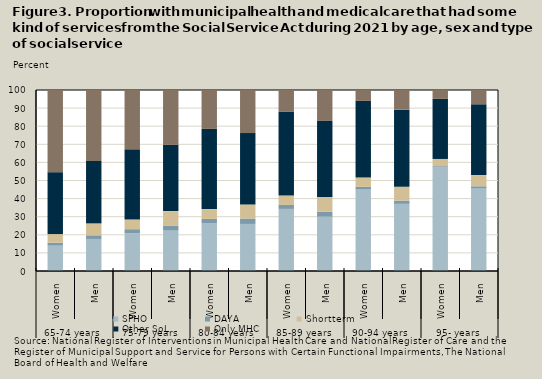
| Category | SPHO | DAYA | Shortterm | Other SoL | Only MHC |
|---|---|---|---|---|---|
| 0 | 14 | 1.6 | 4.8 | 34.2 | 45.4 |
| 1 | 17.7 | 2 | 6.6 | 34.5 | 39.2 |
| 2 | 20.9 | 2.2 | 5.3 | 38.8 | 32.8 |
| 3 | 22.3 | 2.6 | 8.2 | 36.6 | 30.3 |
| 4 | 26.5 | 2.3 | 5.4 | 44.3 | 21.5 |
| 5 | 26 | 3 | 7.8 | 39.4 | 23.8 |
| 6 | 34.3 | 2.2 | 5.2 | 46.4 | 11.9 |
| 7 | 30 | 2.7 | 8.2 | 42 | 17.1 |
| 8 | 45.1 | 1.4 | 5.1 | 42.4 | 6 |
| 9 | 37.1 | 1.8 | 7.6 | 42.6 | 10.9 |
| 10 | 57.2 | 0.7 | 4 | 33.2 | 4.9 |
| 11 | 45.8 | 1 | 6.2 | 39.1 | 8 |